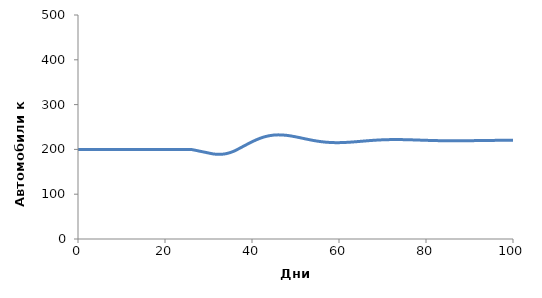
| Category | Запас автомобилей |
|---|---|
| 0.0 | 200 |
| 1.0 | 200 |
| 2.0 | 200 |
| 3.0 | 200 |
| 4.0 | 200 |
| 5.0 | 200 |
| 6.0 | 200 |
| 7.0 | 200 |
| 8.0 | 200 |
| 9.0 | 200 |
| 10.0 | 200 |
| 11.0 | 200 |
| 12.0 | 200 |
| 13.0 | 200 |
| 14.0 | 200 |
| 15.0 | 200 |
| 16.0 | 200 |
| 17.0 | 200 |
| 18.0 | 200 |
| 19.0 | 200 |
| 20.0 | 200 |
| 21.0 | 200 |
| 22.0 | 200 |
| 23.0 | 200 |
| 24.0 | 200 |
| 25.0 | 200 |
| 26.0 | 200 |
| 27.0 | 198 |
| 28.0 | 196 |
| 29.0 | 194 |
| 30.0 | 192 |
| 31.0 | 190 |
| 32.0 | 188.889 |
| 33.0 | 189 |
| 34.0 | 190.333 |
| 35.0 | 192.889 |
| 36.0 | 196.667 |
| 37.0 | 201.667 |
| 38.0 | 206.852 |
| 39.0 | 212.019 |
| 40.0 | 216.963 |
| 41.0 | 221.481 |
| 42.0 | 225.37 |
| 43.0 | 228.426 |
| 44.0 | 230.617 |
| 45.0 | 231.948 |
| 46.0 | 232.454 |
| 47.0 | 232.207 |
| 48.0 | 231.312 |
| 49.0 | 229.907 |
| 50.0 | 228.138 |
| 51.0 | 226.147 |
| 52.0 | 224.071 |
| 53.0 | 222.037 |
| 54.0 | 220.151 |
| 55.0 | 218.5 |
| 56.0 | 217.144 |
| 57.0 | 216.119 |
| 58.0 | 215.441 |
| 59.0 | 215.101 |
| 60.0 | 215.076 |
| 61.0 | 215.326 |
| 62.0 | 215.802 |
| 63.0 | 216.449 |
| 64.0 | 217.209 |
| 65.0 | 218.025 |
| 66.0 | 218.846 |
| 67.0 | 219.625 |
| 68.0 | 220.325 |
| 69.0 | 220.916 |
| 70.0 | 221.382 |
| 71.0 | 221.711 |
| 72.0 | 221.903 |
| 73.0 | 221.966 |
| 74.0 | 221.911 |
| 75.0 | 221.759 |
| 76.0 | 221.528 |
| 77.0 | 221.243 |
| 78.0 | 220.926 |
| 79.0 | 220.599 |
| 80.0 | 220.28 |
| 81.0 | 219.987 |
| 82.0 | 219.732 |
| 83.0 | 219.525 |
| 84.0 | 219.371 |
| 85.0 | 219.271 |
| 86.0 | 219.224 |
| 87.0 | 219.226 |
| 88.0 | 219.271 |
| 89.0 | 219.35 |
| 90.0 | 219.455 |
| 91.0 | 219.577 |
| 92.0 | 219.706 |
| 93.0 | 219.835 |
| 94.0 | 219.956 |
| 95.0 | 220.065 |
| 96.0 | 220.155 |
| 97.0 | 220.226 |
| 98.0 | 220.275 |
| 99.0 | 220.303 |
| 100.0 | 220.31 |